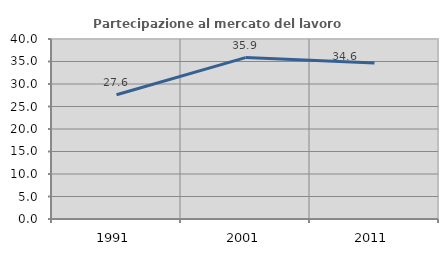
| Category | Partecipazione al mercato del lavoro  femminile |
|---|---|
| 1991.0 | 27.614 |
| 2001.0 | 35.864 |
| 2011.0 | 34.642 |